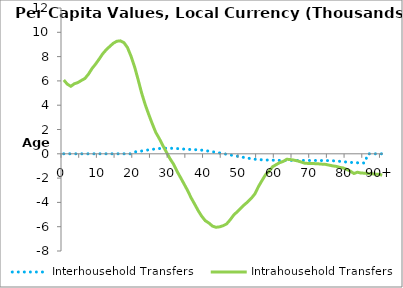
| Category | Interhousehold Transfers | Intrahousehold Transfers |
|---|---|---|
| 0 | 0 | 6072.071 |
|  | 0 | 5733.146 |
| 2 | 0 | 5558.263 |
| 3 | 0 | 5765.566 |
| 4 | 0 | 5865.47 |
| 5 | 0 | 6041.667 |
| 6 | 0 | 6203.658 |
| 7 | 0 | 6565.576 |
| 8 | 0 | 7024.428 |
| 9 | 0 | 7386.108 |
| 10 | 0 | 7797.061 |
| 11 | 0 | 8229.034 |
| 12 | 0 | 8565.643 |
| 13 | 0 | 8837.892 |
| 14 | 0 | 9098.178 |
| 15 | 0 | 9264.6 |
| 16 | 0 | 9297.038 |
| 17 | 0 | 9150.241 |
| 18 | 0 | 8746.116 |
| 19 | 0 | 8037.224 |
| 20 | 152.991 | 7174.825 |
| 21 | 187.959 | 6118.478 |
| 22 | 230.339 | 5005.677 |
| 23 | 277.949 | 4059.72 |
| 24 | 323.803 | 3249.215 |
| 25 | 367.419 | 2479.295 |
| 26 | 404.601 | 1761.481 |
| 27 | 432.632 | 1250.549 |
| 28 | 445.646 | 678.364 |
| 29 | 458.223 | 142.319 |
| 30 | 456.718 | -396.199 |
| 31 | 448.555 | -839.234 |
| 32 | 430.166 | -1434.162 |
| 33 | 410.823 | -1953.177 |
| 34 | 386.46 | -2484.393 |
| 35 | 369.477 | -3023.922 |
| 36 | 352.256 | -3629.897 |
| 37 | 339.967 | -4147.528 |
| 38 | 326.217 | -4682.675 |
| 39 | 300.77 | -5146.744 |
| 40 | 262.915 | -5506.783 |
| 41 | 221.214 | -5694.512 |
| 42 | 172.43 | -5945.727 |
| 43 | 122.383 | -6048.354 |
| 44 | 73.334 | -6012.522 |
| 45 | 21.851 | -5922.268 |
| 46 | -35.732 | -5776.129 |
| 47 | -89.963 | -5442.27 |
| 48 | -145.008 | -5049.435 |
| 49 | -197.673 | -4773.823 |
| 50 | -252.741 | -4487.102 |
| 51 | -306.242 | -4201.915 |
| 52 | -357.284 | -3954.979 |
| 53 | -404.791 | -3662.159 |
| 54 | -445.527 | -3301.993 |
| 55 | -476.169 | -2710.433 |
| 56 | -495.343 | -2210.747 |
| 57 | -508.246 | -1731.764 |
| 58 | -518.843 | -1450.346 |
| 59 | -527.596 | -1067.503 |
| 60 | -535.886 | -896.817 |
| 61 | -540.915 | -729.905 |
| 62 | -544.54 | -627.998 |
| 63 | -545.356 | -451.981 |
| 64 | -545.828 | -469.336 |
| 65 | -543.853 | -519.923 |
| 66 | -546.433 | -581.012 |
| 67 | -547.582 | -666.123 |
| 68 | -547.697 | -768.039 |
| 69 | -547.258 | -793.071 |
| 70 | -548.73 | -799.722 |
| 71 | -549.444 | -809.713 |
| 72 | -550.886 | -826.995 |
| 73 | -554.009 | -852.533 |
| 74 | -557.463 | -871.363 |
| 75 | -560.893 | -932.258 |
| 76 | -574.399 | -994.914 |
| 77 | -594.328 | -1037.291 |
| 78 | -619.162 | -1117.159 |
| 79 | -649.227 | -1167.244 |
| 80 | -682.328 | -1287.212 |
| 81 | -706.127 | -1430.007 |
| 82 | -724.734 | -1622.242 |
| 83 | -738.315 | -1515.435 |
| 84 | -747.951 | -1584.75 |
| 85 | -757.009 | -1593.689 |
| 86 | 0 | -1631.089 |
| 87 | 0 | -1642.736 |
| 88 | 0 | -1669.703 |
| 89 | 0 | -1688.766 |
| 90+ | 0 | -1758.404 |